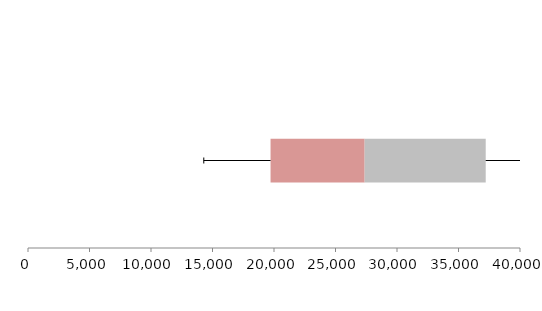
| Category | Series 1 | Series 2 | Series 3 |
|---|---|---|---|
| 0 | 19719.768 | 7650.704 | 9842.292 |